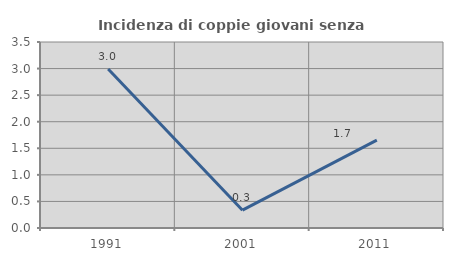
| Category | Incidenza di coppie giovani senza figli |
|---|---|
| 1991.0 | 2.993 |
| 2001.0 | 0.336 |
| 2011.0 | 1.653 |